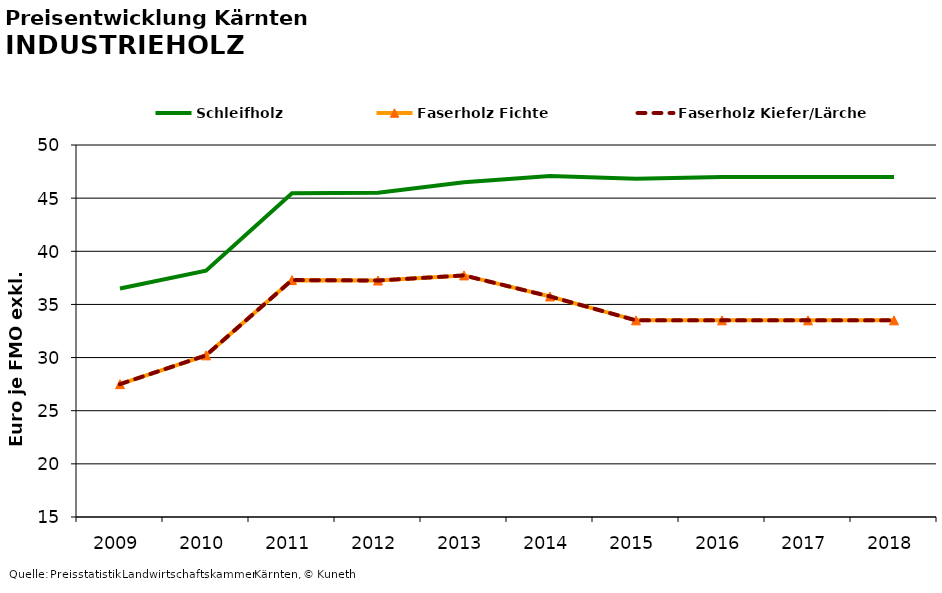
| Category | Schleifholz | Faserholz Fichte | Faserholz Kiefer/Lärche |
|---|---|---|---|
| 2009.0 | 36.5 | 27.5 | 27.5 |
| 2010.0 | 38.167 | 30.208 | 30.208 |
| 2011.0 | 45.458 | 37.292 | 37.292 |
| 2012.0 | 45.5 | 37.25 | 37.25 |
| 2013.0 | 46.5 | 37.729 | 37.729 |
| 2014.0 | 47.083 | 35.75 | 35.75 |
| 2015.0 | 46.833 | 33.5 | 33.5 |
| 2016.0 | 47 | 33.5 | 33.5 |
| 2017.0 | 47 | 33.5 | 33.5 |
| 2018.0 | 47 | 33.5 | 33.5 |